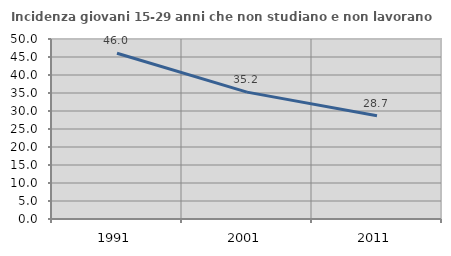
| Category | Incidenza giovani 15-29 anni che non studiano e non lavorano  |
|---|---|
| 1991.0 | 46.05 |
| 2001.0 | 35.238 |
| 2011.0 | 28.696 |